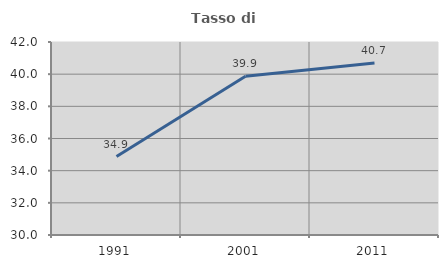
| Category | Tasso di occupazione   |
|---|---|
| 1991.0 | 34.88 |
| 2001.0 | 39.874 |
| 2011.0 | 40.694 |